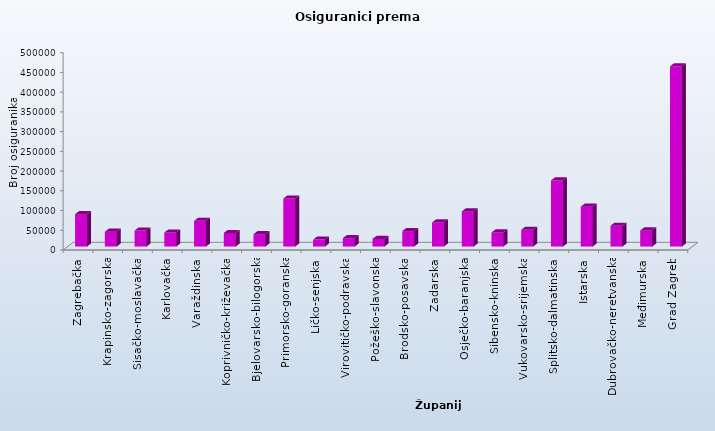
| Category | Series 0 |
|---|---|
| Zagrebačka | 82111 |
| Krapinsko-zagorska | 37621 |
| Sisačko-moslavačka | 40550 |
| Karlovačka | 35675 |
| Varaždinska | 65100 |
| Koprivničko-križevačka | 34324 |
| Bjelovarsko-bilogorska | 31562 |
| Primorsko-goranska | 121775 |
| Ličko-senjska | 17551 |
| Virovitičko-podravska | 21166 |
| Požeško-slavonska | 19388 |
| Brodsko-posavska | 39190 |
| Zadarska | 61038 |
| Osječko-baranjska | 89062 |
| Šibensko-kninska | 35750 |
| Vukovarsko-srijemska | 42569 |
| Splitsko-dalmatinska | 167632 |
| Istarska | 101028 |
| Dubrovačko-neretvanska | 52746 |
| Međimurska | 40933 |
| Grad Zagreb | 456812 |